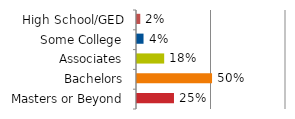
| Category | Series 0 | Series 1 |
|---|---|---|
| Masters or Beyond |  | 0.248 |
| Bachelors |  | 0.504 |
| Associates |  | 0.182 |
| Some College |  | 0.044 |
| High School/GED |  | 0.022 |